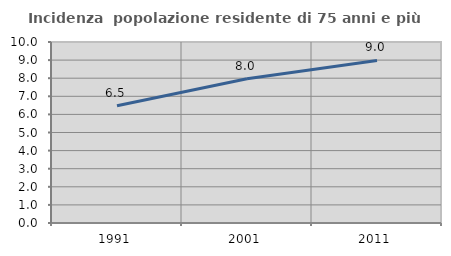
| Category | Incidenza  popolazione residente di 75 anni e più |
|---|---|
| 1991.0 | 6.478 |
| 2001.0 | 7.974 |
| 2011.0 | 8.981 |